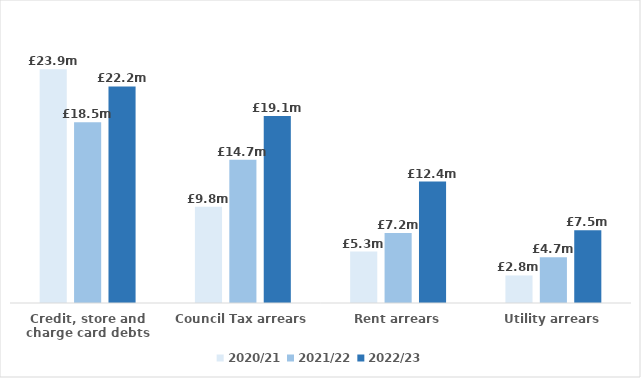
| Category | 2020/21 | 2021/22 | 2022/23 |
|---|---|---|---|
| Credit, store and charge card debts | 23924675.913 | 18509174.379 | 22178896.209 |
| Council Tax arrears | 9845767.916 | 14674960.793 | 19142071.509 |
| Rent arrears | 5269116.951 | 7155142.977 | 12435430.718 |
| Utility arrears | 2819721.589 | 4675127.237 | 7461348.99 |